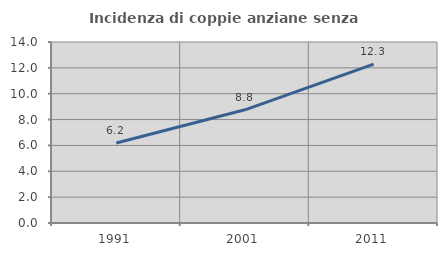
| Category | Incidenza di coppie anziane senza figli  |
|---|---|
| 1991.0 | 6.188 |
| 2001.0 | 8.756 |
| 2011.0 | 12.295 |